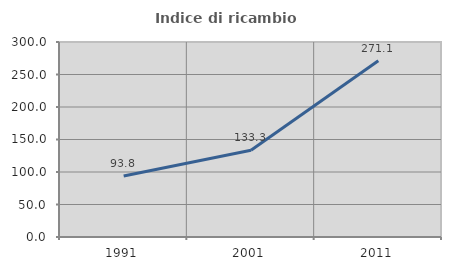
| Category | Indice di ricambio occupazionale  |
|---|---|
| 1991.0 | 93.846 |
| 2001.0 | 133.333 |
| 2011.0 | 271.111 |